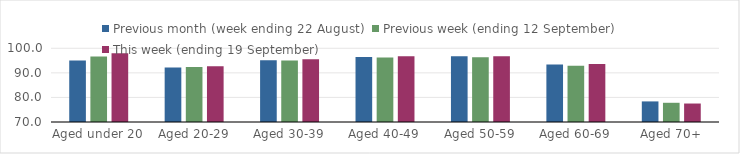
| Category | Previous month (week ending 22 August) | Previous week (ending 12 September) | This week (ending 19 September) |
|---|---|---|---|
| Aged under 20 | 95.01 | 96.64 | 97.98 |
| Aged 20-29 | 92.14 | 92.42 | 92.68 |
| Aged 30-39 | 95.14 | 95.04 | 95.58 |
| Aged 40-49 | 96.47 | 96.23 | 96.74 |
| Aged 50-59 | 96.74 | 96.36 | 96.79 |
| Aged 60-69 | 93.43 | 92.86 | 93.6 |
| Aged 70+ | 78.38 | 77.82 | 77.52 |